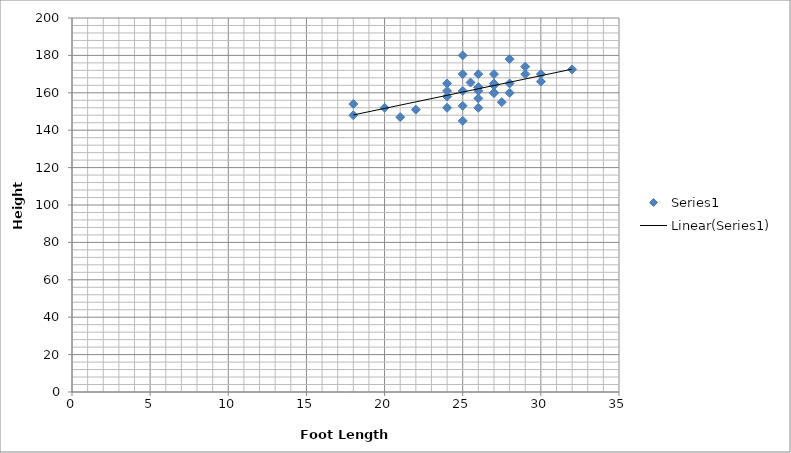
| Category | Series 0 |
|---|---|
| 25.0 | 145 |
| 29.0 | 170 |
| 24.0 | 161 |
| 25.0 | 161 |
| 24.0 | 158 |
| 18.0 | 154 |
| 22.0 | 151 |
| 32.0 | 172.5 |
| 27.0 | 160 |
| 21.0 | 147 |
| 30.0 | 170 |
| 24.0 | 165 |
| 27.0 | 160 |
| 26.0 | 161 |
| 26.0 | 152 |
| 27.5 | 155 |
| 30.0 | 166 |
| 28.0 | 165 |
| 26.0 | 163 |
| 26.0 | 163 |
| 25.0 | 170 |
| 26.0 | 170 |
| 24.0 | 152 |
| 28.0 | 160 |
| 25.0 | 153 |
| 26.0 | 157 |
| 25.5 | 165.5 |
| 27.0 | 165 |
| 28.0 | 178 |
| 27.0 | 164 |
| 18.0 | 148 |
| 20.0 | 152 |
| 25.0 | 180 |
| 29.0 | 174 |
| 27.0 | 160 |
| 27.0 | 170 |